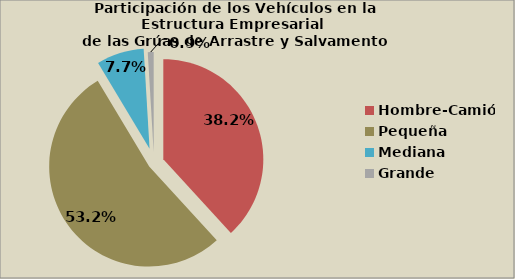
| Category | Series 0 |
|---|---|
| Hombre-Camión | 38.191 |
| Pequeña | 53.201 |
| Mediana | 7.664 |
| Grande | 0.944 |